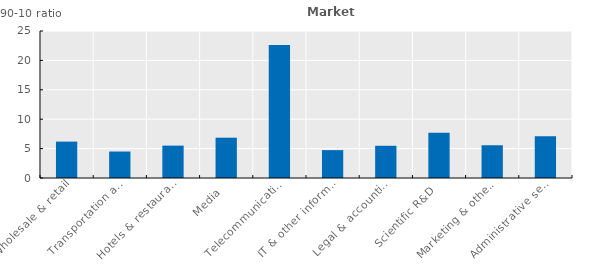
| Category | Series 0 |
|---|---|
| Wholesale & retail | 6.191 |
| Transportation and storage | 4.503 |
| Hotels & restaurants | 5.506 |
| Media  | 6.853 |
| Telecommunications  | 22.634 |
| IT & other information serv. | 4.737 |
| Legal & accounting | 5.48 |
| Scientific R&D  | 7.694 |
| Marketing & other  | 5.57 |
| Administrative services  | 7.102 |